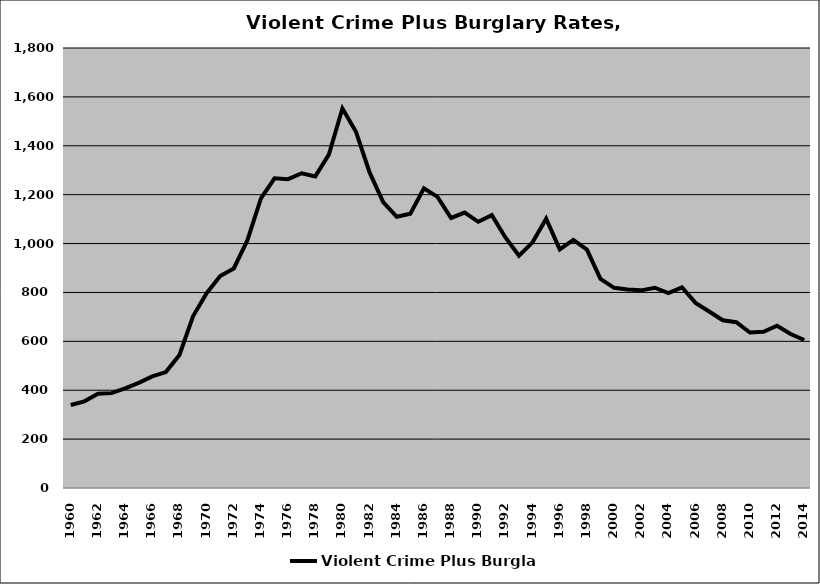
| Category | Violent Crime Plus Burglary |
|---|---|
| 1960.0 | 339.633 |
| 1961.0 | 354.532 |
| 1962.0 | 385.673 |
| 1963.0 | 388.079 |
| 1964.0 | 407.803 |
| 1965.0 | 430.058 |
| 1966.0 | 456.34 |
| 1967.0 | 474.249 |
| 1968.0 | 544.113 |
| 1969.0 | 702.228 |
| 1970.0 | 796.906 |
| 1971.0 | 867.077 |
| 1972.0 | 898.148 |
| 1973.0 | 1012.987 |
| 1974.0 | 1185.106 |
| 1975.0 | 1266.707 |
| 1976.0 | 1263.418 |
| 1977.0 | 1287.631 |
| 1978.0 | 1274.829 |
| 1979.0 | 1363.757 |
| 1980.0 | 1552.305 |
| 1981.0 | 1456.934 |
| 1982.0 | 1291.088 |
| 1983.0 | 1169.565 |
| 1984.0 | 1109.491 |
| 1985.0 | 1122.09 |
| 1986.0 | 1226.022 |
| 1987.0 | 1190.982 |
| 1988.0 | 1104.705 |
| 1989.0 | 1126.726 |
| 1990.0 | 1088.951 |
| 1991.0 | 1116.266 |
| 1992.0 | 1025.023 |
| 1993.0 | 950.591 |
| 1994.0 | 1004.854 |
| 1995.0 | 1101.806 |
| 1996.0 | 976.283 |
| 1997.0 | 1015.041 |
| 1998.0 | 975.264 |
| 1999.0 | 855.397 |
| 2000.0 | 818.963 |
| 2001.0 | 811.61 |
| 2002.0 | 808.563 |
| 2003.0 | 819.219 |
| 2004.0 | 797.268 |
| 2005.0 | 821.063 |
| 2006.0 | 757.127 |
| 2007.0 | 721.888 |
| 2008.0 | 686.282 |
| 2009.0 | 678.419 |
| 2010.0 | 635.82 |
| 2011.0 | 638.803 |
| 2012.0 | 663.579 |
| 2013.0 | 630.192 |
| 2014.0 | 605.458 |